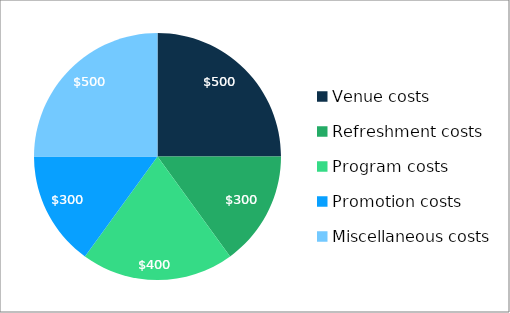
| Category | Series 0 |
|---|---|
| Venue costs | 500 |
| Refreshment costs | 300 |
| Program costs | 400 |
| Promotion costs | 300 |
| Miscellaneous costs | 500 |